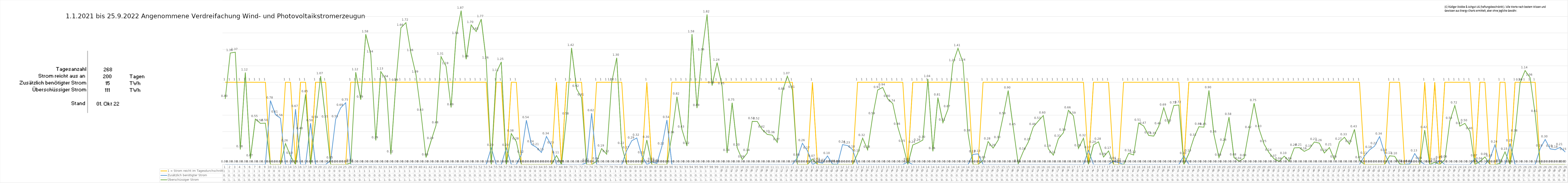
| Category | 1 = Strom reicht im Tagesdurchschnitt | Zusätzlich benötigter Strom | Überschüssiger Strom |
|---|---|---|---|
| 0 | 1 | 0 | 0.798 |
| 1 | 1 | 0 | 1.356 |
| 2 | 1 | 0 | 1.366 |
| 3 | 1 | 0 | 0.184 |
| 4 | 1 | 0 | 1.118 |
| 5 | 1 | 0 | 0.073 |
| 6 | 1 | 0 | 0.553 |
| 7 | 1 | 0 | 0.501 |
| 8 | 1 | 0 | 0.503 |
| 9 | 0 | 0.777 | 0 |
| 10 | 0 | 0.606 | 0 |
| 11 | 0 | 0.563 | 0 |
| 12 | 1 | 0 | 0.255 |
| 13 | 1 | 0 | 0.104 |
| 14 | 0 | 0.673 | 0 |
| 15 | 1 | 0 | 0.405 |
| 16 | 1 | 0 | 0.852 |
| 17 | 0 | 0.502 | 0 |
| 18 | 1 | 0 | 0.54 |
| 19 | 1 | 0 | 1.074 |
| 20 | 1 | 0 | 0.546 |
| 21 | 0 | 0.048 | 0 |
| 22 | 0 | 0.55 | 0 |
| 23 | 0 | 0.688 | 0 |
| 24 | 0 | 0.751 | 0 |
| 25 | 1 | 0 | 0.018 |
| 26 | 1 | 0 | 1.121 |
| 27 | 1 | 0 | 0.788 |
| 28 | 1 | 0 | 1.583 |
| 29 | 1 | 0 | 1.338 |
| 30 | 1 | 0 | 0.293 |
| 31 | 1 | 0 | 1.13 |
| 32 | 1 | 0 | 1.037 |
| 33 | 1 | 0 | 0.123 |
| 34 | 1 | 0 | 0.992 |
| 35 | 1 | 0 | 1.662 |
| 36 | 1 | 0 | 1.724 |
| 37 | 1 | 0 | 1.355 |
| 38 | 1 | 0 | 1.094 |
| 39 | 1 | 0 | 0.628 |
| 40 | 1 | 0 | 0.085 |
| 41 | 1 | 0 | 0.286 |
| 42 | 1 | 0 | 0.476 |
| 43 | 1 | 0 | 1.311 |
| 44 | 1 | 0 | 1.194 |
| 45 | 1 | 0 | 0.694 |
| 46 | 1 | 0 | 1.563 |
| 47 | 1 | 0 | 1.87 |
| 48 | 1 | 0 | 1.28 |
| 49 | 1 | 0 | 1.697 |
| 50 | 1 | 0 | 1.616 |
| 51 | 1 | 0 | 1.767 |
| 52 | 1 | 0 | 1.264 |
| 53 | 0 | 0.202 | 0 |
| 54 | 1 | 0 | 1.112 |
| 55 | 1 | 0 | 1.247 |
| 56 | 0 | 0.202 | 0 |
| 57 | 1 | 0 | 0.376 |
| 58 | 1 | 0 | 0.278 |
| 59 | 0 | 0.118 | 0 |
| 60 | 0 | 0.538 | 0 |
| 61 | 0 | 0.244 | 0 |
| 62 | 0 | 0.209 | 0 |
| 63 | 0 | 0.147 | 0 |
| 64 | 0 | 0.341 | 0 |
| 65 | 0 | 0.231 | 0 |
| 66 | 1 | 0 | 0.11 |
| 67 | 0 | 0.003 | 0 |
| 68 | 1 | 0 | 0.584 |
| 69 | 1 | 0 | 1.417 |
| 70 | 1 | 0 | 0.92 |
| 71 | 1 | 0 | 0.813 |
| 72 | 0 | 0.019 | 0 |
| 73 | 0 | 0.624 | 0 |
| 74 | 1 | 0 | 0.038 |
| 75 | 1 | 0 | 0.193 |
| 76 | 1 | 0 | 0.125 |
| 77 | 1 | 0 | 0.999 |
| 78 | 1 | 0 | 1.297 |
| 79 | 1 | 0 | 0.224 |
| 80 | 0 | 0.171 | 0 |
| 81 | 0 | 0.289 | 0 |
| 82 | 0 | 0.323 | 0 |
| 83 | 0 | 0.11 | 0 |
| 84 | 1 | 0 | 0.298 |
| 85 | 0 | 0.032 | 0 |
| 86 | 0 | 0.013 | 0 |
| 87 | 0 | 0.22 | 0 |
| 88 | 0 | 0.541 | 0 |
| 89 | 1 | 0 | 0.357 |
| 90 | 1 | 0 | 0.825 |
| 91 | 1 | 0 | 0.425 |
| 92 | 1 | 0 | 0.225 |
| 93 | 1 | 0 | 1.583 |
| 94 | 1 | 0 | 0.686 |
| 95 | 1 | 0 | 1.361 |
| 96 | 1 | 0 | 1.824 |
| 97 | 1 | 0 | 0.96 |
| 98 | 1 | 0 | 1.239 |
| 99 | 1 | 0 | 0.951 |
| 100 | 1 | 0 | 0.14 |
| 101 | 1 | 0 | 0.751 |
| 102 | 1 | 0 | 0.205 |
| 103 | 1 | 0 | 0.06 |
| 104 | 1 | 0 | 0.138 |
| 105 | 1 | 0 | 0.525 |
| 106 | 1 | 0 | 0.524 |
| 107 | 1 | 0 | 0.425 |
| 108 | 1 | 0 | 0.366 |
| 109 | 1 | 0 | 0.357 |
| 110 | 1 | 0 | 0.269 |
| 111 | 1 | 0 | 0.884 |
| 112 | 1 | 0 | 1.074 |
| 113 | 1 | 0 | 0.908 |
| 114 | 0 | 0.082 | 0 |
| 115 | 0 | 0.258 | 0 |
| 116 | 0 | 0.168 | 0 |
| 117 | 1 | 0 | 0.068 |
| 118 | 0 | 0.031 | 0 |
| 119 | 0 | 0.016 | 0 |
| 120 | 0 | 0.104 | 0 |
| 121 | 0 | 0.005 | 0 |
| 122 | 0 | 0.003 | 0 |
| 123 | 0 | 0.242 | 0 |
| 124 | 0 | 0.23 | 0 |
| 125 | 0 | 0.181 | 0 |
| 126 | 1 | 0 | 0.134 |
| 127 | 1 | 0 | 0.321 |
| 128 | 1 | 0 | 0.178 |
| 129 | 1 | 0 | 0.585 |
| 130 | 1 | 0 | 0.906 |
| 131 | 1 | 0 | 0.937 |
| 132 | 1 | 0 | 0.798 |
| 133 | 1 | 0 | 0.741 |
| 134 | 1 | 0 | 0.458 |
| 135 | 1 | 0 | 0.25 |
| 136 | 0 | 0.03 | 0 |
| 137 | 1 | 0 | 0.238 |
| 138 | 1 | 0 | 0.263 |
| 139 | 1 | 0 | 0.298 |
| 140 | 1 | 0 | 1.04 |
| 141 | 1 | 0 | 0.161 |
| 142 | 1 | 0 | 0.812 |
| 143 | 1 | 0 | 0.509 |
| 144 | 1 | 0 | 0.672 |
| 145 | 1 | 0 | 1.232 |
| 146 | 1 | 0 | 1.413 |
| 147 | 1 | 0 | 1.238 |
| 148 | 1 | 0 | 0.379 |
| 149 | 0 | 0.123 | 0 |
| 150 | 0 | 0.129 | 0 |
| 151 | 1 | 0 | 0.052 |
| 152 | 1 | 0 | 0.279 |
| 153 | 1 | 0 | 0.199 |
| 154 | 1 | 0 | 0.296 |
| 155 | 1 | 0 | 0.585 |
| 156 | 1 | 0 | 0.899 |
| 157 | 1 | 0 | 0.452 |
| 158 | 1 | 0 | 0.009 |
| 159 | 1 | 0 | 0.156 |
| 160 | 1 | 0 | 0.272 |
| 161 | 1 | 0 | 0.456 |
| 162 | 1 | 0 | 0.528 |
| 163 | 1 | 0 | 0.595 |
| 164 | 1 | 0 | 0.191 |
| 165 | 1 | 0 | 0.114 |
| 166 | 1 | 0 | 0.312 |
| 167 | 1 | 0 | 0.386 |
| 168 | 1 | 0 | 0.659 |
| 169 | 1 | 0 | 0.592 |
| 170 | 1 | 0 | 0.196 |
| 171 | 1 | 0 | 0.32 |
| 172 | 0 | 0.174 | 0 |
| 173 | 1 | 0 | 0.24 |
| 174 | 1 | 0 | 0.276 |
| 175 | 1 | 0 | 0.09 |
| 176 | 1 | 0 | 0.165 |
| 177 | 0 | 0.041 | 0 |
| 178 | 0 | 0.023 | 0 |
| 179 | 1 | 0 | 0 |
| 180 | 1 | 0 | 0.136 |
| 181 | 1 | 0 | 0.116 |
| 182 | 1 | 0 | 0.505 |
| 183 | 1 | 0 | 0.468 |
| 184 | 1 | 0 | 0.354 |
| 185 | 1 | 0 | 0.345 |
| 186 | 1 | 0 | 0.464 |
| 187 | 1 | 0 | 0.69 |
| 188 | 1 | 0 | 0.498 |
| 189 | 1 | 0 | 0.717 |
| 190 | 1 | 0 | 0.723 |
| 191 | 0 | 0.104 | 0 |
| 192 | 1 | 0 | 0.132 |
| 193 | 1 | 0 | 0.323 |
| 194 | 1 | 0 | 0.459 |
| 195 | 1 | 0 | 0.454 |
| 196 | 1 | 0 | 0.901 |
| 197 | 1 | 0 | 0.364 |
| 198 | 1 | 0 | 0.084 |
| 199 | 1 | 0 | 0.264 |
| 200 | 1 | 0 | 0.577 |
| 201 | 1 | 0 | 0.085 |
| 202 | 1 | 0 | 0.039 |
| 203 | 1 | 0 | 0.077 |
| 204 | 1 | 0 | 0.418 |
| 205 | 1 | 0 | 0.746 |
| 206 | 1 | 0 | 0.431 |
| 207 | 1 | 0 | 0.247 |
| 208 | 1 | 0 | 0.142 |
| 209 | 1 | 0 | 0.068 |
| 210 | 1 | 0 | 0.037 |
| 211 | 1 | 0 | 0.102 |
| 212 | 1 | 0 | 0.038 |
| 213 | 1 | 0 | 0.202 |
| 214 | 1 | 0 | 0.206 |
| 215 | 1 | 0 | 0.16 |
| 216 | 1 | 0 | 0.19 |
| 217 | 1 | 0 | 0.274 |
| 218 | 1 | 0 | 0.26 |
| 219 | 1 | 0 | 0.14 |
| 220 | 1 | 0 | 0.206 |
| 221 | 1 | 0 | 0.061 |
| 222 | 1 | 0 | 0.275 |
| 223 | 1 | 0 | 0.331 |
| 224 | 1 | 0 | 0.247 |
| 225 | 1 | 0 | 0.427 |
| 226 | 1 | 0 | 0.051 |
| 227 | 0 | 0.105 | 0 |
| 228 | 0 | 0.177 | 0 |
| 229 | 0 | 0.223 | 0 |
| 230 | 0 | 0.339 | 0 |
| 231 | 0 | 0.139 | 0 |
| 232 | 1 | 0 | 0.105 |
| 233 | 1 | 0 | 0.1 |
| 234 | 1 | 0 | 0.009 |
| 235 | 0 | 0.004 | 0 |
| 236 | 0 | 0.007 | 0 |
| 237 | 0 | 0.133 | 0 |
| 238 | 0 | 0.044 | 0 |
| 239 | 1 | 0 | 0.418 |
| 240 | 0 | 0.001 | 0 |
| 241 | 1 | 0 | 0.028 |
| 242 | 0 | 0.05 | 0 |
| 243 | 1 | 0 | 0.059 |
| 244 | 1 | 0 | 0.528 |
| 245 | 1 | 0 | 0.716 |
| 246 | 1 | 0 | 0.467 |
| 247 | 1 | 0 | 0.5 |
| 248 | 1 | 0 | 0.404 |
| 249 | 0 | 0.074 | 0 |
| 250 | 1 | 0 | 0.037 |
| 251 | 1 | 0 | 0.092 |
| 252 | 0 | 0.073 | 0 |
| 253 | 0 | 0.24 | 0 |
| 254 | 1 | 0 | 0.014 |
| 255 | 1 | 0 | 0.154 |
| 256 | 0 | 0.255 | 0 |
| 257 | 1 | 0 | 0.376 |
| 258 | 1 | 0 | 0.994 |
| 259 | 1 | 0 | 1.143 |
| 260 | 1 | 0 | 1.055 |
| 261 | 1 | 0 | 0.613 |
| 262 | 0 | 0.194 | 0 |
| 263 | 0 | 0.304 | 0 |
| 264 | 0 | 0.19 | 0 |
| 265 | 0 | 0.18 | 0 |
| 266 | 0 | 0.209 | 0 |
| 267 | 0 | 0.152 | 0 |